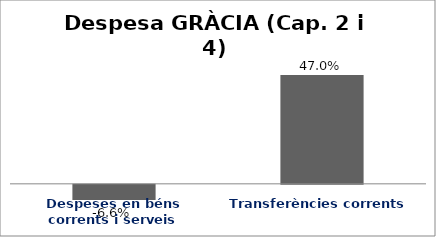
| Category | Series 0 |
|---|---|
| Despeses en béns corrents i serveis | -0.066 |
| Transferències corrents | 0.47 |